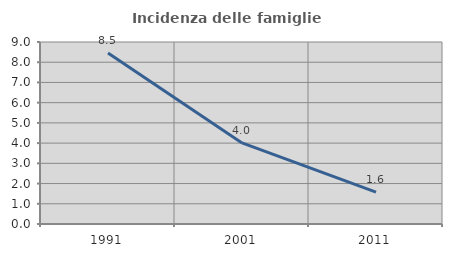
| Category | Incidenza delle famiglie numerose |
|---|---|
| 1991.0 | 8.451 |
| 2001.0 | 4.009 |
| 2011.0 | 1.573 |